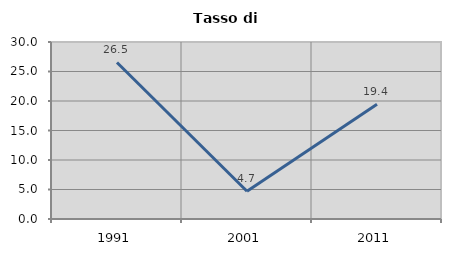
| Category | Tasso di disoccupazione   |
|---|---|
| 1991.0 | 26.531 |
| 2001.0 | 4.706 |
| 2011.0 | 19.444 |